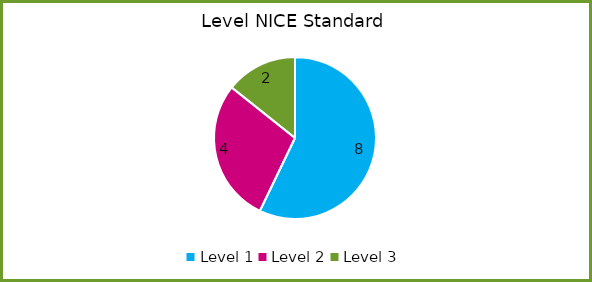
| Category | Series 0 |
|---|---|
| Level 1 | 8 |
| Level 2 | 4 |
| Level 3 | 2 |